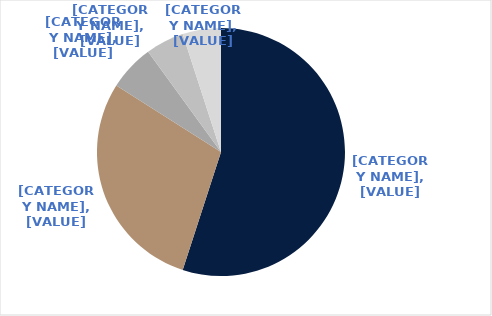
| Category | Series 0 |
|---|---|
| Sydney | 0.55 |
| Melbourne | 0.29 |
| Perth | 0.06 |
| Canberra | 0.05 |
| Brisbane | 0.05 |